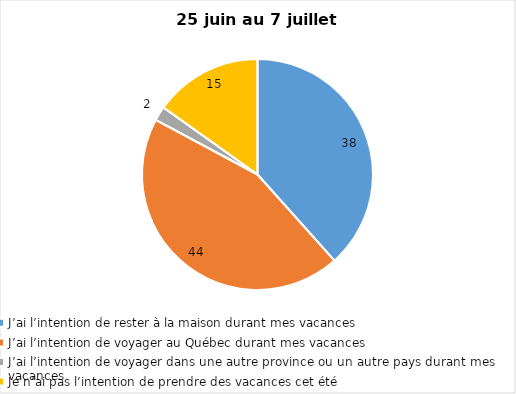
| Category | Series 0 |
|---|---|
| J’ai l’intention de rester à la maison durant mes vacances | 38 |
| J’ai l’intention de voyager au Québec durant mes vacances | 44 |
| J’ai l’intention de voyager dans une autre province ou un autre pays durant mes vacances | 2 |
| Je n’ai pas l’intention de prendre des vacances cet été | 15 |